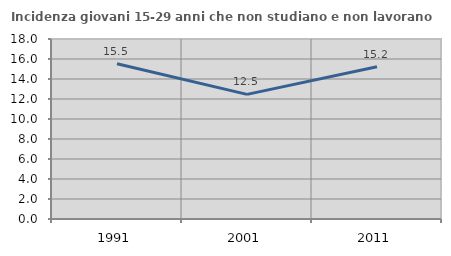
| Category | Incidenza giovani 15-29 anni che non studiano e non lavorano  |
|---|---|
| 1991.0 | 15.523 |
| 2001.0 | 12.46 |
| 2011.0 | 15.227 |